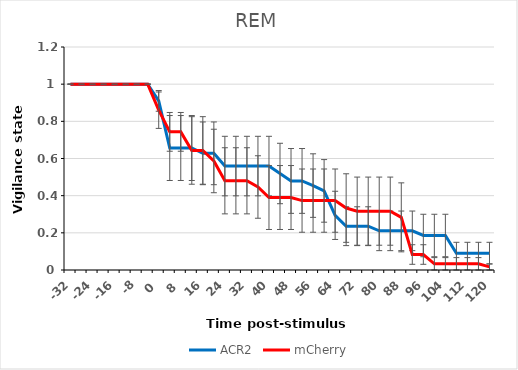
| Category | ACR2 | mCherry |
|---|---|---|
| -32.0 | 1 | 1 |
| -28.0 | 1 | 1 |
| -24.0 | 1 | 1 |
| -20.0 | 1 | 1 |
| -16.0 | 1 | 1 |
| -12.0 | 1 | 1 |
| -8.0 | 1 | 1 |
| -4.0 | 1 | 1 |
| 0.0 | 0.91 | 0.86 |
| 4.0 | 0.656 | 0.743 |
| 8.0 | 0.656 | 0.743 |
| 12.0 | 0.656 | 0.643 |
| 16.0 | 0.628 | 0.643 |
| 20.0 | 0.628 | 0.587 |
| 24.0 | 0.559 | 0.48 |
| 28.0 | 0.559 | 0.48 |
| 32.0 | 0.559 | 0.48 |
| 36.0 | 0.559 | 0.447 |
| 40.0 | 0.559 | 0.39 |
| 44.0 | 0.519 | 0.39 |
| 48.0 | 0.479 | 0.39 |
| 52.0 | 0.479 | 0.373 |
| 56.0 | 0.454 | 0.373 |
| 60.0 | 0.426 | 0.373 |
| 64.0 | 0.294 | 0.373 |
| 68.0 | 0.236 | 0.333 |
| 72.0 | 0.236 | 0.317 |
| 76.0 | 0.236 | 0.317 |
| 80.0 | 0.211 | 0.317 |
| 84.0 | 0.211 | 0.317 |
| 88.0 | 0.211 | 0.283 |
| 92.0 | 0.211 | 0.083 |
| 96.0 | 0.186 | 0.083 |
| 100.0 | 0.186 | 0.033 |
| 104.0 | 0.186 | 0.033 |
| 108.0 | 0.09 | 0.033 |
| 112.0 | 0.09 | 0.033 |
| 116.0 | 0.09 | 0.033 |
| 120.0 | 0.09 | 0.017 |